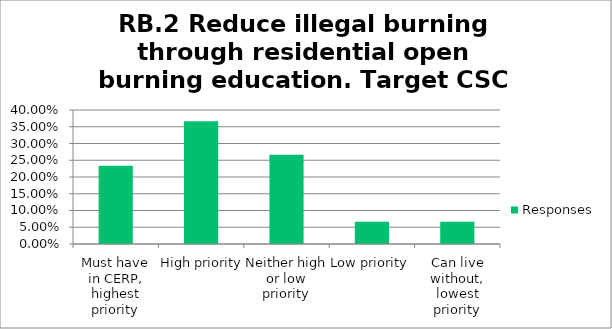
| Category | Responses |
|---|---|
| Must have in CERP, highest priority | 0.233 |
| High priority | 0.367 |
| Neither high or low priority | 0.267 |
| Low priority | 0.067 |
| Can live without, lowest priority | 0.067 |